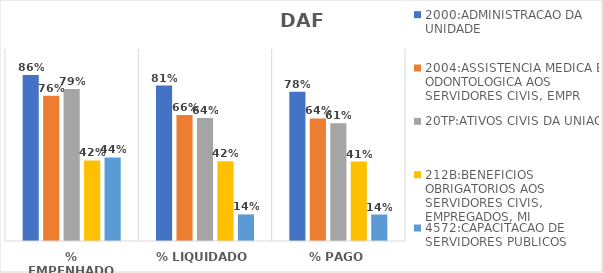
| Category | 2000:ADMINISTRACAO DA UNIDADE | 2004:ASSISTENCIA MEDICA E ODONTOLOGICA AOS SERVIDORES CIVIS, EMPR | 20TP:ATIVOS CIVIS DA UNIAO | 212B:BENEFICIOS OBRIGATORIOS AOS SERVIDORES CIVIS, EMPREGADOS, MI | 4572:CAPACITACAO DE SERVIDORES PUBLICOS FEDERAIS EM PROCESSO DE Q |
|---|---|---|---|---|---|
| % EMPENHADO | 0.865 | 0.757 | 0.791 | 0.42 | 0.435 |
| % LIQUIDADO | 0.809 | 0.657 | 0.641 | 0.415 | 0.138 |
| % PAGO | 0.778 | 0.638 | 0.614 | 0.414 | 0.138 |